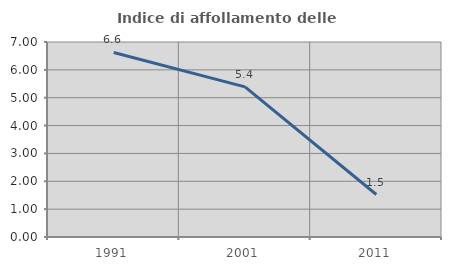
| Category | Indice di affollamento delle abitazioni  |
|---|---|
| 1991.0 | 6.624 |
| 2001.0 | 5.388 |
| 2011.0 | 1.525 |